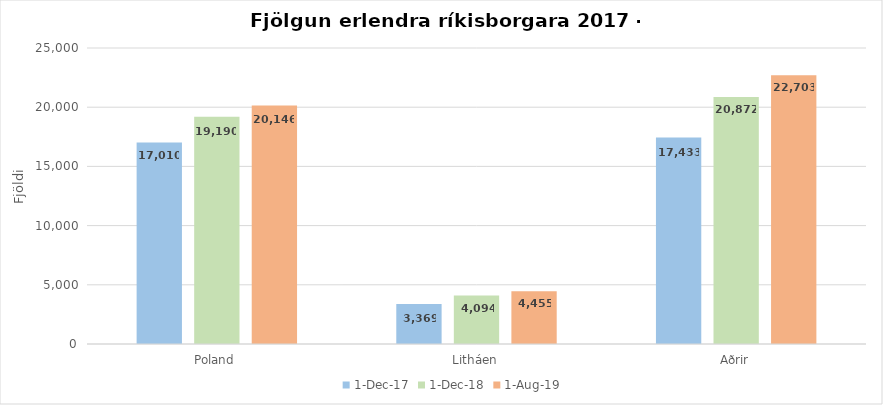
| Category | 01.des.17 | 01.des.18 | 01.ágú.19 |
|---|---|---|---|
| Poland | 17010 | 19190 | 20146 |
| Litháen | 3369 | 4094 | 4455 |
| Aðrir | 17433 | 20872 | 22703 |